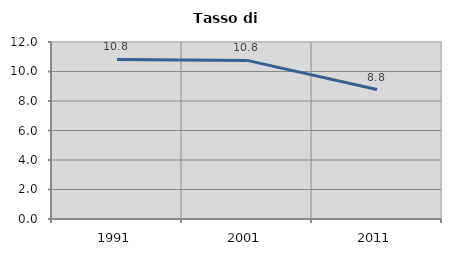
| Category | Tasso di disoccupazione   |
|---|---|
| 1991.0 | 10.821 |
| 2001.0 | 10.753 |
| 2011.0 | 8.779 |